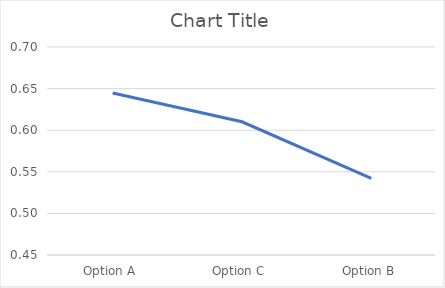
| Category | Series 0 |
|---|---|
| Option A | 0.645 |
| Option C | 0.61 |
| Option B | 0.542 |